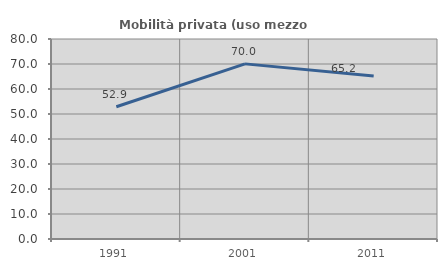
| Category | Mobilità privata (uso mezzo privato) |
|---|---|
| 1991.0 | 52.881 |
| 2001.0 | 70.048 |
| 2011.0 | 65.203 |